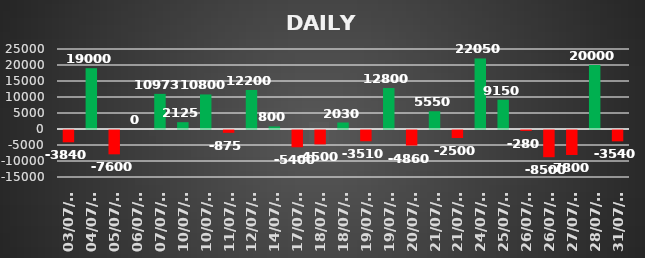
| Category | Series 0 |
|---|---|
| 2023-07-03 | -3840 |
| 2023-07-04 | 19000 |
| 2023-07-05 | -7600 |
| 2023-07-06 | 0 |
| 2023-07-07 | 10972.5 |
| 2023-07-10 | 2125 |
| 2023-07-10 | 10800 |
| 2023-07-11 | -875 |
| 2023-07-12 | 12200 |
| 2023-07-14 | 800 |
| 2023-07-17 | -5400 |
| 2023-07-18 | -4500 |
| 2023-07-18 | 2030 |
| 2023-07-19 | -3510 |
| 2023-07-19 | 12800 |
| 2023-07-20 | -4860 |
| 2023-07-21 | 5550 |
| 2023-07-21 | -2500 |
| 2023-07-24 | 22050 |
| 2023-07-25 | 9150 |
| 2023-07-26 | -280 |
| 2023-07-26 | -8500 |
| 2023-07-27 | -7800 |
| 2023-07-28 | 20000 |
| 2023-07-31 | -3540 |